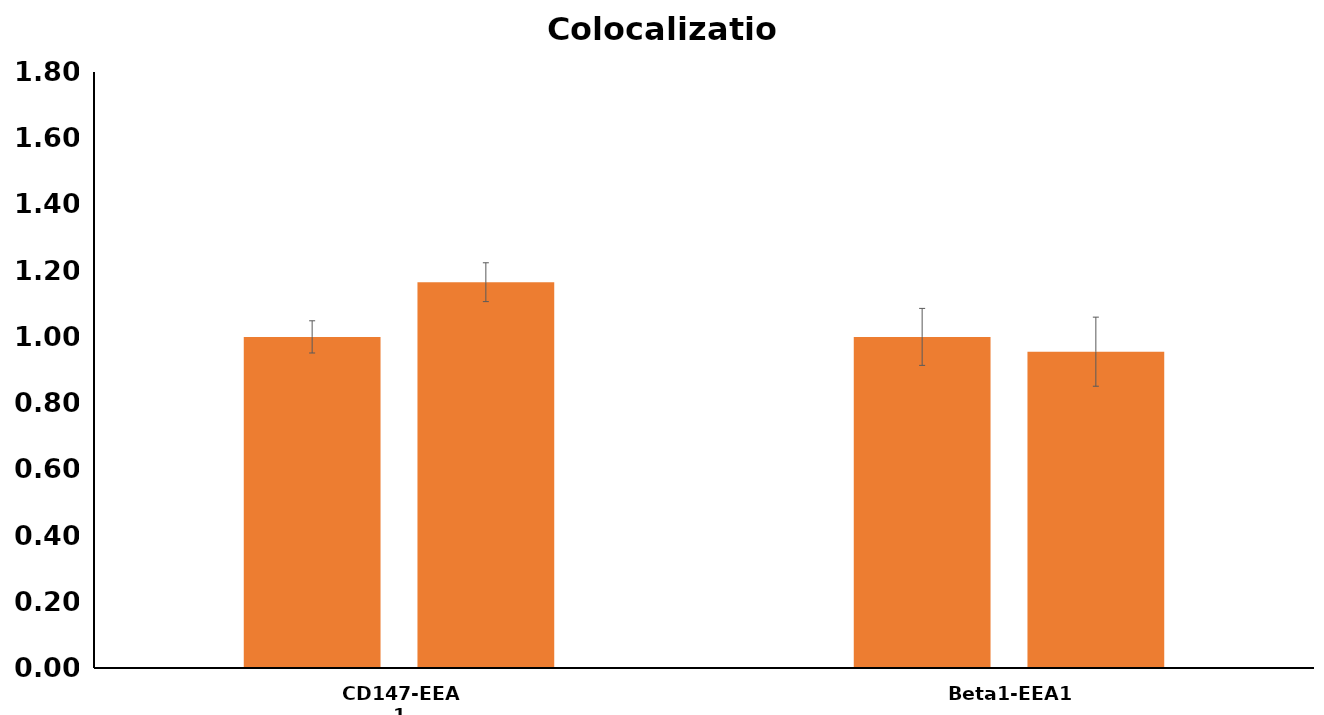
| Category | Control | siHOOK1 |
|---|---|---|
| 0 | 1 | 1.165 |
| 1 | 1 | 0.955 |